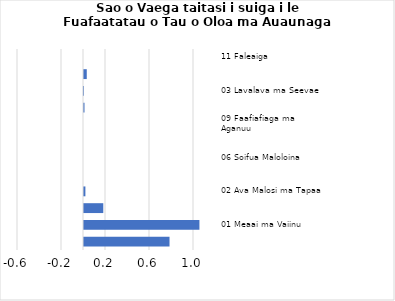
| Category |     Contributions |
|---|---|
| 11 Faleaiga | 0 |
| 05 Meafale, Mea Faigaluega/Faaleleia o Aiga | 0.025 |
| 03 Lavalava ma Seevae | -0.001 |
| 12 Isi Oloa ma Auaunaga | 0.005 |
| 09 Faafiafiaga ma Aganuu | 0 |
| 10 Aoaoga | 0 |
| 06 Soifua Maloloina | 0 |
| 08 Fesootaiga | 0 |
| 02 Ava Malosi ma Tapaa | 0.013 |
| 04 Fale, Suavai, Eletise, Kesi ma isi | 0.175 |
| 01 Meaai ma Vaiinu | 1.049 |
| 07 Femalagaiga | 0.778 |